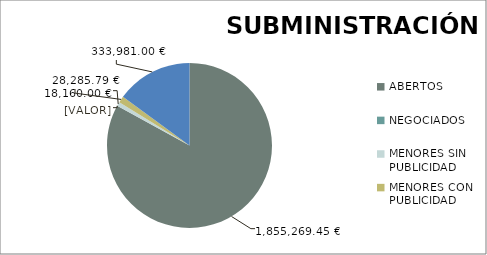
| Category | Series 0 |
|---|---|
| ABERTOS  | 1855269.45 |
| NEGOCIADOS  | 0 |
| MENORES SIN PUBLICIDAD | 18160 |
| MENORES CON PUBLICIDAD | 28285.79 |
| PROCEDEMENTO SIMPLIFICADO | 333981 |